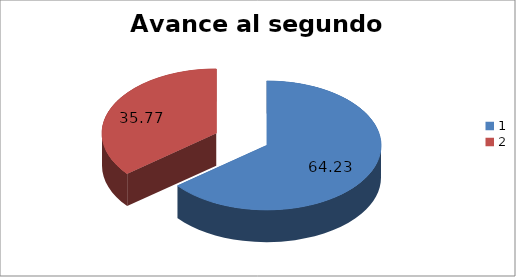
| Category | Series 0 |
|---|---|
| 0 | 64.228 |
| 1 | 35.772 |